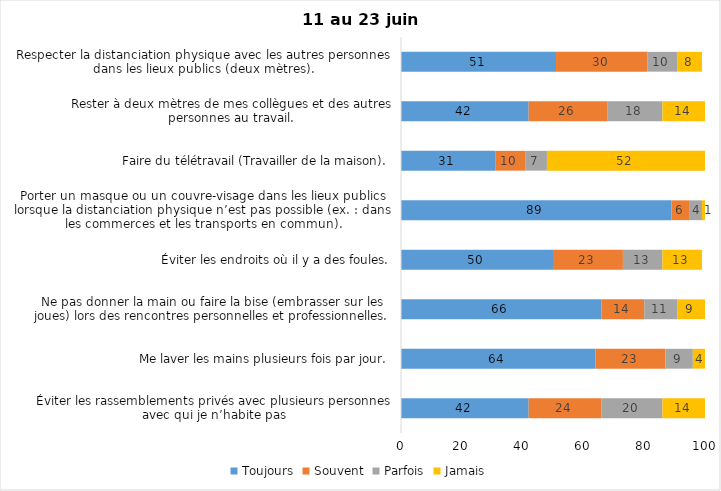
| Category | Toujours | Souvent | Parfois | Jamais |
|---|---|---|---|---|
| Éviter les rassemblements privés avec plusieurs personnes avec qui je n’habite pas | 42 | 24 | 20 | 14 |
| Me laver les mains plusieurs fois par jour. | 64 | 23 | 9 | 4 |
| Ne pas donner la main ou faire la bise (embrasser sur les joues) lors des rencontres personnelles et professionnelles. | 66 | 14 | 11 | 9 |
| Éviter les endroits où il y a des foules. | 50 | 23 | 13 | 13 |
| Porter un masque ou un couvre-visage dans les lieux publics lorsque la distanciation physique n’est pas possible (ex. : dans les commerces et les transports en commun). | 89 | 6 | 4 | 1 |
| Faire du télétravail (Travailler de la maison). | 31 | 10 | 7 | 52 |
| Rester à deux mètres de mes collègues et des autres personnes au travail. | 42 | 26 | 18 | 14 |
| Respecter la distanciation physique avec les autres personnes dans les lieux publics (deux mètres). | 51 | 30 | 10 | 8 |